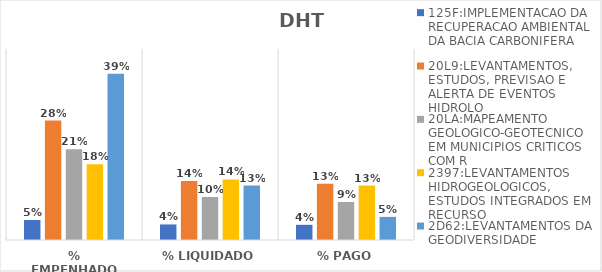
| Category | 125F:IMPLEMENTACAO DA RECUPERACAO AMBIENTAL DA BACIA CARBONIFERA | 20L9:LEVANTAMENTOS, ESTUDOS, PREVISAO E ALERTA DE EVENTOS HIDROLO | 20LA:MAPEAMENTO GEOLOGICO-GEOTECNICO EM MUNICIPIOS CRITICOS COM R | 2397:LEVANTAMENTOS HIDROGEOLOGICOS, ESTUDOS INTEGRADOS EM RECURSO | 2D62:LEVANTAMENTOS DA GEODIVERSIDADE |
|---|---|---|---|---|---|
| % EMPENHADO | 0.047 | 0.281 | 0.214 | 0.178 | 0.392 |
| % LIQUIDADO | 0.037 | 0.139 | 0.101 | 0.143 | 0.128 |
| % PAGO | 0.036 | 0.133 | 0.09 | 0.128 | 0.054 |